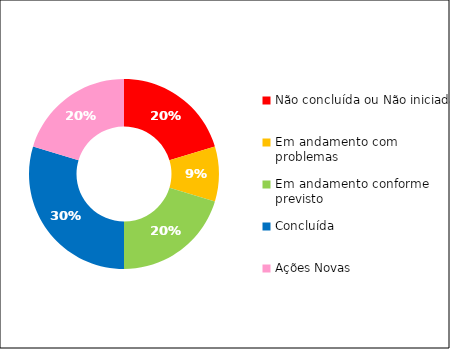
| Category | Series 0 |
|---|---|
| Início planejado posterior | 0 |
| Não concluída ou Não iniciada | 13 |
| Em andamento com problemas | 6 |
| Em andamento conforme previsto | 13 |
| Concluída | 19 |
| Ações Novas | 13 |